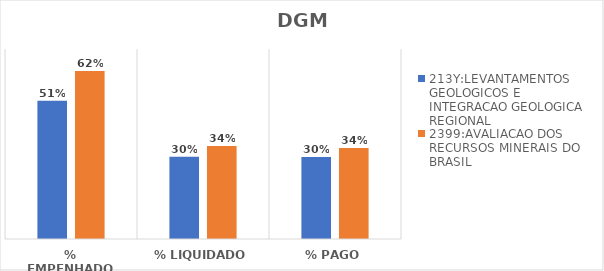
| Category | 213Y:LEVANTAMENTOS GEOLOGICOS E INTEGRACAO GEOLOGICA REGIONAL | 2399:AVALIACAO DOS RECURSOS MINERAIS DO BRASIL |
|---|---|---|
| % EMPENHADO | 0.509 | 0.619 |
| % LIQUIDADO | 0.303 | 0.343 |
| % PAGO | 0.302 | 0.336 |